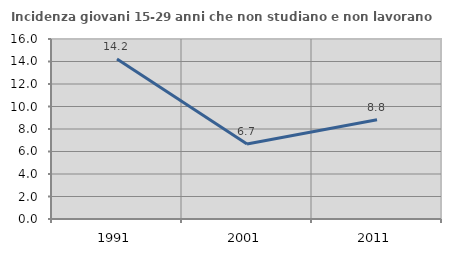
| Category | Incidenza giovani 15-29 anni che non studiano e non lavorano  |
|---|---|
| 1991.0 | 14.216 |
| 2001.0 | 6.667 |
| 2011.0 | 8.824 |